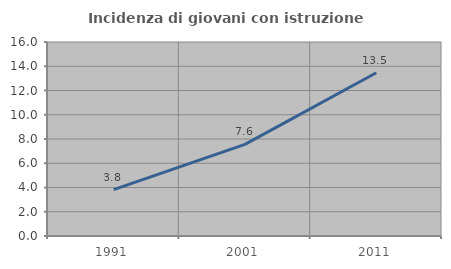
| Category | Incidenza di giovani con istruzione universitaria |
|---|---|
| 1991.0 | 3.822 |
| 2001.0 | 7.558 |
| 2011.0 | 13.462 |